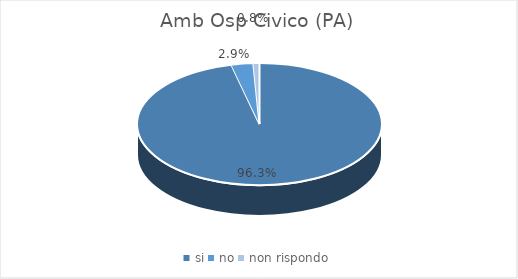
| Category | Amb Osp Civico (PA) |
|---|---|
| si | 0.963 |
| no | 0.029 |
| non rispondo | 0.008 |